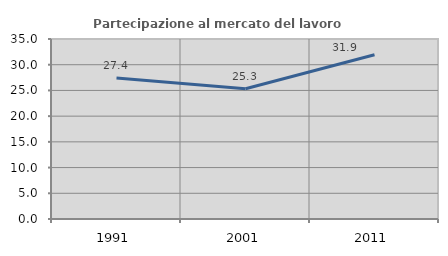
| Category | Partecipazione al mercato del lavoro  femminile |
|---|---|
| 1991.0 | 27.423 |
| 2001.0 | 25.339 |
| 2011.0 | 31.941 |